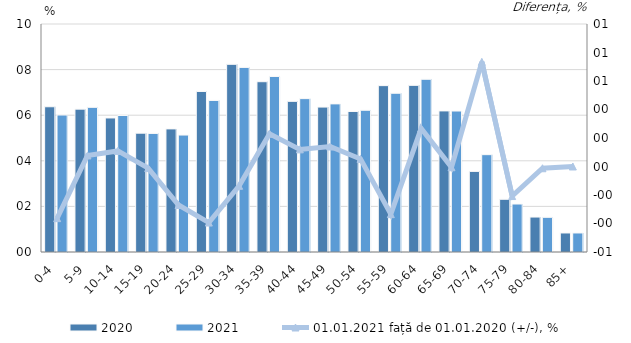
| Category | 2020 | 2021 |
|---|---|---|
| 0-4 | 6.37 | 6.008 |
| 5-9 | 6.266 | 6.344 |
| 10-14 | 5.879 | 5.988 |
| 15-19 | 5.212 | 5.201 |
| 20-24 | 5.399 | 5.129 |
| 25-29 | 7.04 | 6.647 |
| 30-34 | 8.232 | 8.096 |
| 35-39 | 7.469 | 7.699 |
| 40-44 | 6.606 | 6.727 |
| 45-49 | 6.356 | 6.496 |
| 50-54 | 6.164 | 6.217 |
| 55-59 | 7.297 | 6.962 |
| 60-64 | 7.308 | 7.575 |
| 65-69 | 6.188 | 6.183 |
| 70-74 | 3.535 | 4.269 |
| 75-79 | 2.312 | 2.104 |
| 80-84 | 1.533 | 1.521 |
| 85+ | 0.834 | 0.834 |